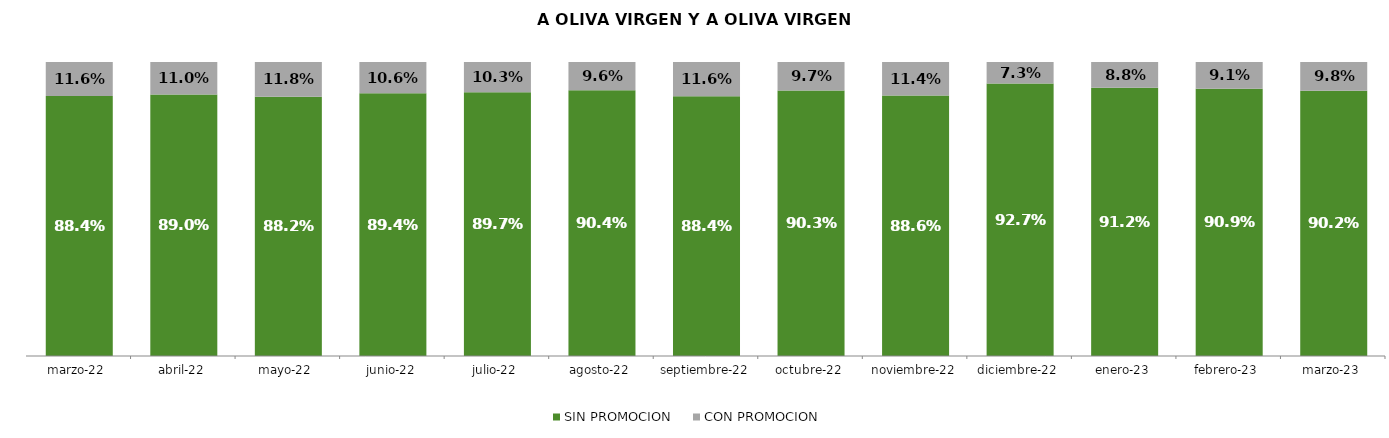
| Category | SIN PROMOCION   | CON PROMOCION   |
|---|---|---|
| 2022-03-01 | 0.884 | 0.116 |
| 2022-04-01 | 0.89 | 0.11 |
| 2022-05-01 | 0.882 | 0.118 |
| 2022-06-01 | 0.894 | 0.106 |
| 2022-07-01 | 0.897 | 0.103 |
| 2022-08-01 | 0.904 | 0.096 |
| 2022-09-01 | 0.884 | 0.116 |
| 2022-10-01 | 0.903 | 0.097 |
| 2022-11-01 | 0.886 | 0.114 |
| 2022-12-01 | 0.927 | 0.073 |
| 2023-01-01 | 0.912 | 0.088 |
| 2023-02-01 | 0.909 | 0.091 |
| 2023-03-01 | 0.902 | 0.098 |